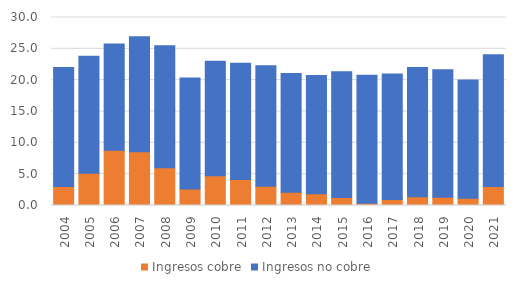
| Category | Ingresos cobre | Ingresos no cobre |
|---|---|---|
| 2004.0 | 3.026 | 19.014 |
| 2005.0 | 5.134 | 18.696 |
| 2006.0 | 8.813 | 16.972 |
| 2007.0 | 8.593 | 18.326 |
| 2008.0 | 6.013 | 19.472 |
| 2009.0 | 2.652 | 17.708 |
| 2010.0 | 4.73 | 18.301 |
| 2011.0 | 4.167 | 18.552 |
| 2012.0 | 3.091 | 19.206 |
| 2013.0 | 2.099 | 18.946 |
| 2014.0 | 1.88 | 18.859 |
| 2015.0 | 1.264 | 20.062 |
| 2016.0 | 0.361 | 20.428 |
| 2017.0 | 0.955 | 20.016 |
| 2018.0 | 1.389 | 20.637 |
| 2019.0 | 1.329 | 20.328 |
| 2020.0 | 1.176 | 18.848 |
| 2021.0 | 3.027 | 21.027 |